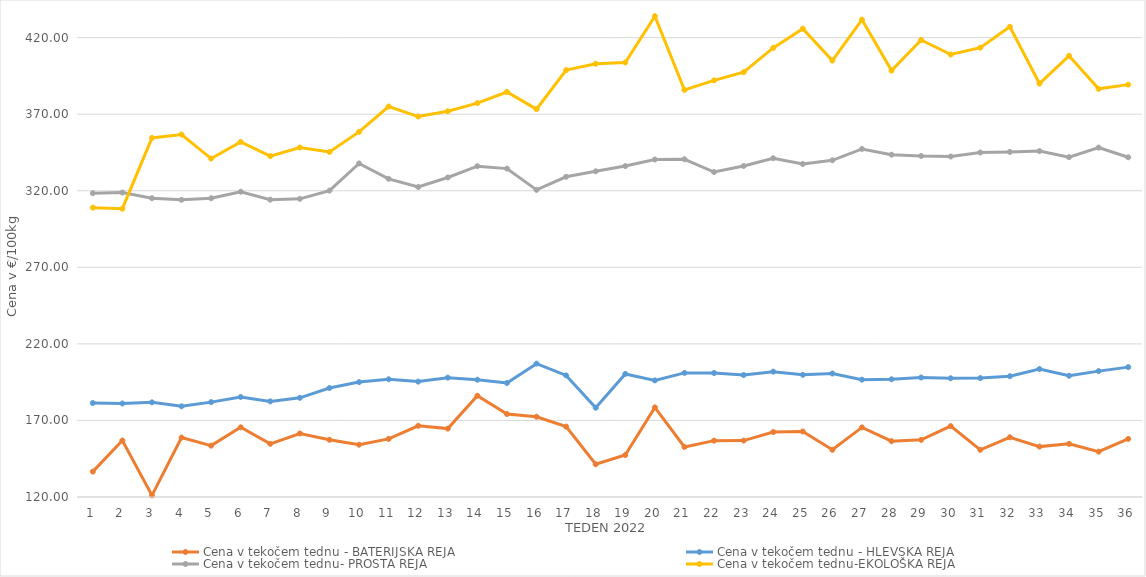
| Category | Cena v tekočem tednu - BATERIJSKA REJA | Cena v tekočem tednu - HLEVSKA REJA | Cena v tekočem tednu- PROSTA REJA | Cena v tekočem tednu-EKOLOŠKA REJA |
|---|---|---|---|---|
| 1.0 | 136.59 | 181.38 | 318.4 | 308.97 |
| 2.0 | 156.88 | 181.07 | 318.82 | 308.28 |
| 3.0 | 121.07 | 181.83 | 315.14 | 354.48 |
| 4.0 | 158.82 | 179.22 | 314.08 | 356.72 |
| 5.0 | 153.55 | 181.96 | 315.1 | 341.03 |
| 6.0 | 165.51 | 185.31 | 319.38 | 351.9 |
| 7.0 | 154.74 | 182.45 | 314.16 | 342.59 |
| 8.0 | 161.48 | 184.77 | 314.71 | 348.28 |
| 9.0 | 157.38 | 191.21 | 320.1 | 345.35 |
| 10.0 | 154.16 | 195.04 | 337.83 | 358.45 |
| 11.0 | 157.96 | 196.88 | 327.79 | 375 |
| 12.0 | 166.49 | 195.36 | 322.46 | 368.45 |
| 13.0 | 164.66 | 197.95 | 328.67 | 371.9 |
| 14.0 | 186.11 | 196.59 | 336.02 | 377.24 |
| 15.0 | 174.18 | 194.49 | 334.46 | 384.48 |
| 16.0 | 172.42 | 207.1 | 320.58 | 373.28 |
| 17.0 | 165.96 | 199.41 | 329.11 | 398.79 |
| 18.0 | 141.36 | 178.29 | 332.71 | 402.93 |
| 19.0 | 147.43 | 200.37 | 336.11 | 403.79 |
| 20.0 | 178.51 | 196.16 | 340.4 | 433.97 |
| 21.0 | 152.67 | 201.05 | 340.55 | 385.86 |
| 22.0 | 156.8 | 200.98 | 332.23 | 392.07 |
| 23.0 | 156.84 | 199.63 | 336.16 | 397.41 |
| 24.0 | 162.44 | 201.86 | 341.24 | 413.28 |
| 25.0 | 162.78 | 199.81 | 337.48 | 425.86 |
| 26.0 | 150.82 | 200.65 | 339.9 | 405 |
| 27.0 | 165.45 | 196.64 | 347.3 | 431.72 |
| 28.0 | 156.46 | 196.88 | 343.56 | 398.45 |
| 29.0 | 157.31 | 198.03 | 342.71 | 418.45 |
| 30.0 | 166.29 | 197.55 | 342.35 | 408.97 |
| 31.0 | 150.81 | 197.66 | 344.97 | 413.45 |
| 32.0 | 158.99 | 198.9 | 345.35 | 427.07 |
| 33.0 | 152.91 | 203.57 | 345.9 | 390 |
| 34.0 | 154.73 | 199.17 | 341.92 | 408.1 |
| 35.0 | 149.6 | 202.21 | 348.2 | 386.55 |
| 36.0 | 157.93 | 204.81 | 341.85 | 389.31 |